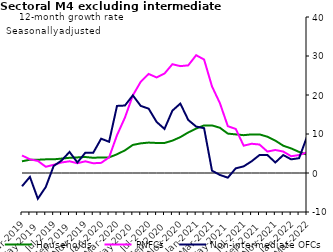
| Category | zero | Households | PNFCs | Non-intermediate OFCs |
|---|---|---|---|---|
| Mar-2019 | 0 | 3 | 4.5 | -3.4 |
| Apr-2019 | 0 | 3.4 | 3.5 | -1 |
| May-2019 | 0 | 3.4 | 3.1 | -6.6 |
| Jun-2019 | 0 | 3.5 | 1.6 | -3.6 |
| Jul-2019 | 0 | 3.5 | 2.1 | 1.8 |
| Aug-2019 | 0 | 3.7 | 2.7 | 3.2 |
| Sep-2019 | 0 | 3.9 | 3 | 5.4 |
| Oct-2019 | 0 | 4 | 2.5 | 2.7 |
| Nov-2019 | 0 | 4.1 | 3 | 5.2 |
| Dec-2019 | 0 | 3.9 | 2.5 | 5.2 |
| Jan-2020 | 0 | 4 | 2.6 | 8.8 |
| Feb-2020 | 0 | 4 | 4 | 8 |
| Mar-2020 | 0 | 4.8 | 9.7 | 17.2 |
| Apr-2020 | 0 | 5.8 | 14.2 | 17.3 |
| May-2020 | 0 | 7.2 | 19.9 | 19.9 |
| Jun-2020 | 0 | 7.6 | 23.4 | 17.2 |
| Jul-2020 | 0 | 7.8 | 25.4 | 16.5 |
| Aug-2020 | 0 | 7.7 | 24.5 | 13.1 |
| Sep-2020 | 0 | 7.7 | 25.5 | 11.3 |
| Oct-2020 | 0 | 8.3 | 27.9 | 16 |
| Nov-2020 | 0 | 9.2 | 27.4 | 17.8 |
| Dec-2020 | 0 | 10.4 | 27.6 | 13.6 |
| Jan-2021 | 0 | 11.4 | 30.2 | 11.9 |
| Feb-2021 | 0 | 12.2 | 29.1 | 11.5 |
| Mar-2021 | 0 | 12.2 | 22.2 | 0.6 |
| Apr-2021 | 0 | 11.6 | 17.9 | -0.5 |
| May-2021 | 0 | 10.1 | 12 | -1.2 |
| Jun-2021 | 0 | 9.9 | 11.3 | 1.2 |
| Jul-2021 | 0 | 9.7 | 7 | 1.7 |
| Aug-2021 | 0 | 9.9 | 7.5 | 3 |
| Sep-2021 | 0 | 9.9 | 7.3 | 4.6 |
| Oct-2021 | 0 | 9.3 | 5.5 | 4.6 |
| Nov-2021 | 0 | 8.3 | 5.9 | 2.7 |
| Dec-2021 | 0 | 7 | 5.5 | 4.6 |
| Jan-2022 | 0 | 6.3 | 4.3 | 3.5 |
| Feb-2022 | 0 | 5.4 | 4.6 | 3.8 |
| Mar-2022 | 0 | 4.7 | 5.3 | 9.3 |